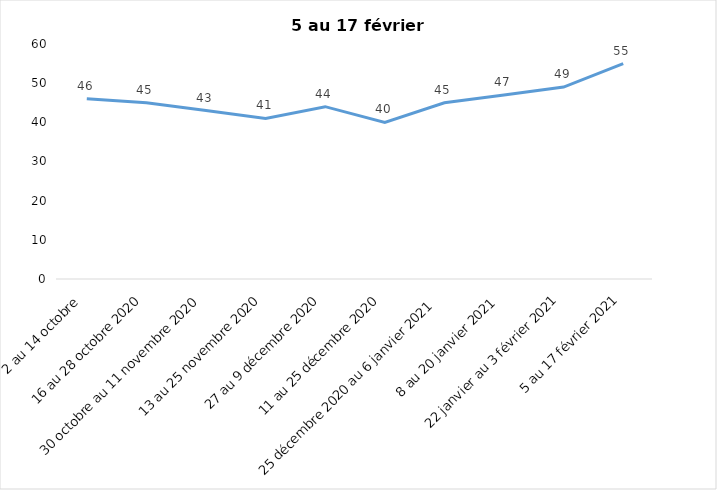
| Category | Toujours aux trois mesures |
|---|---|
| 2 au 14 octobre  | 46 |
| 16 au 28 octobre 2020 | 45 |
| 30 octobre au 11 novembre 2020 | 43 |
| 13 au 25 novembre 2020 | 41 |
| 27 au 9 décembre 2020 | 44 |
| 11 au 25 décembre 2020 | 40 |
| 25 décembre 2020 au 6 janvier 2021 | 45 |
| 8 au 20 janvier 2021 | 47 |
| 22 janvier au 3 février 2021 | 49 |
| 5 au 17 février 2021 | 55 |